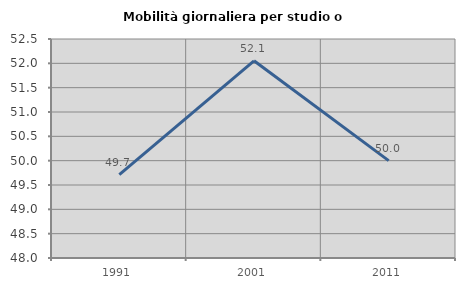
| Category | Mobilità giornaliera per studio o lavoro |
|---|---|
| 1991.0 | 49.713 |
| 2001.0 | 52.052 |
| 2011.0 | 50 |